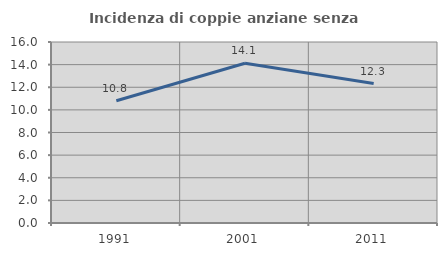
| Category | Incidenza di coppie anziane senza figli  |
|---|---|
| 1991.0 | 10.805 |
| 2001.0 | 14.12 |
| 2011.0 | 12.323 |